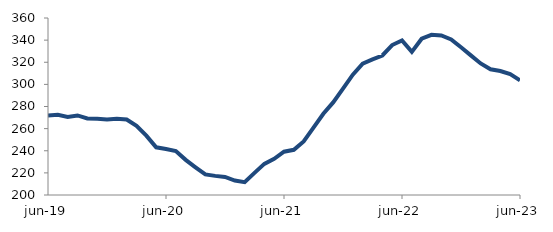
| Category | Series 0 |
|---|---|
| 2019-06-01 | 271.933 |
| 2019-07-01 | 272.528 |
| 2019-08-01 | 270.617 |
| 2019-09-01 | 271.909 |
| 2019-10-01 | 269.246 |
| 2019-11-01 | 268.873 |
| 2019-12-01 | 268.319 |
| 2020-01-01 | 268.914 |
| 2020-02-01 | 268.233 |
| 2020-03-01 | 262.58 |
| 2020-04-01 | 253.663 |
| 2020-05-01 | 243.088 |
| 2020-06-01 | 241.541 |
| 2020-07-01 | 239.786 |
| 2020-08-01 | 231.766 |
| 2020-09-01 | 225.047 |
| 2020-10-01 | 218.571 |
| 2020-11-01 | 217.286 |
| 2020-12-01 | 216.368 |
| 2021-01-01 | 213.087 |
| 2021-02-01 | 211.643 |
| 2021-03-01 | 220.04 |
| 2021-04-01 | 228.12 |
| 2021-05-01 | 232.717 |
| 2021-06-01 | 239.097 |
| 2021-07-01 | 240.846 |
| 2021-08-01 | 248.449 |
| 2021-09-01 | 260.934 |
| 2021-10-01 | 273.441 |
| 2021-11-01 | 283.683 |
| 2021-12-01 | 296.134 |
| 2022-01-01 | 308.804 |
| 2022-02-01 | 318.726 |
| 2022-03-01 | 322.592 |
| 2022-04-01 | 326.114 |
| 2022-05-01 | 335.557 |
| 2022-06-01 | 339.684 |
| 2022-07-01 | 329.357 |
| 2022-08-01 | 341.293 |
| 2022-09-01 | 344.793 |
| 2022-10-01 | 344.185 |
| 2022-11-01 | 340.608 |
| 2022-12-01 | 333.559 |
| 2023-01-01 | 326.199 |
| 2023-02-01 | 318.915 |
| 2023-03-01 | 313.615 |
| 2023-04-01 | 312.076 |
| 2023-05-01 | 309.232 |
| 2023-06-01 | 303.714 |